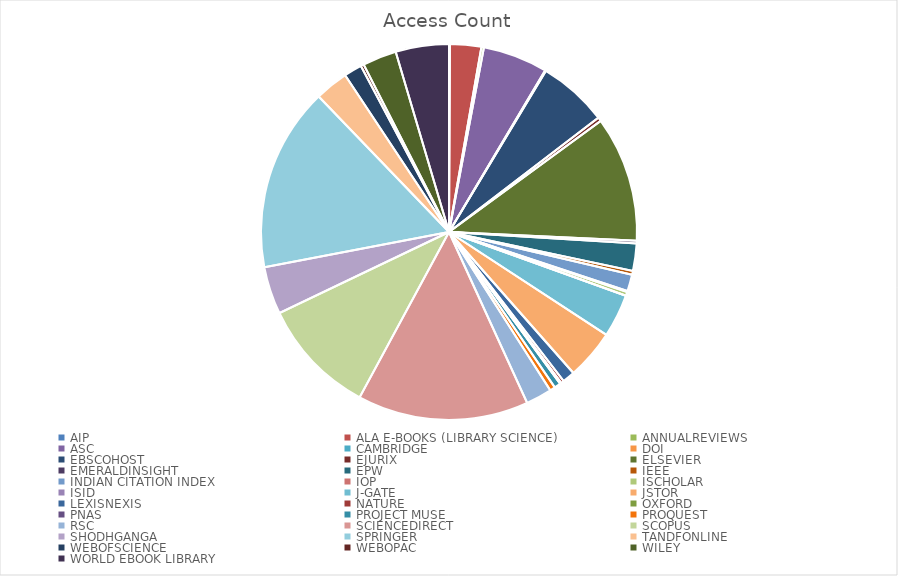
| Category | Access Count |
|---|---|
| AIP | 13 |
| ALA E-BOOKS (LIBRARY SCIENCE) | 446 |
| ANNUALREVIEWS | 36 |
| ASC | 925 |
| CAMBRIDGE | 7 |
| DOI | 6 |
| EBSCOHOST | 995 |
| EJURIX | 56 |
| ELSEVIER | 1796 |
| EMERALDINSIGHT | 39 |
| EPW | 389 |
| IEEE | 55 |
| INDIAN CITATION INDEX | 239 |
| IOP | 14 |
| ISCHOLAR | 55 |
| ISID | 2 |
| J-GATE | 615 |
| JSTOR | 712 |
| LEXISNEXIS | 178 |
| NATURE | 43 |
| OXFORD | 16 |
| PNAS | 4 |
| PROJECT MUSE | 90 |
| PROQUEST | 76 |
| RSC | 371 |
| SCIENCEDIRECT | 2446 |
| SCOPUS | 1666 |
| SHODHGANGA | 679 |
| SPRINGER | 2630 |
| TANDFONLINE | 479 |
| WEBOFSCIENCE | 257 |
| WEBOPAC | 44 |
| WILEY | 486 |
| WORLD EBOOK LIBRARY | 761 |